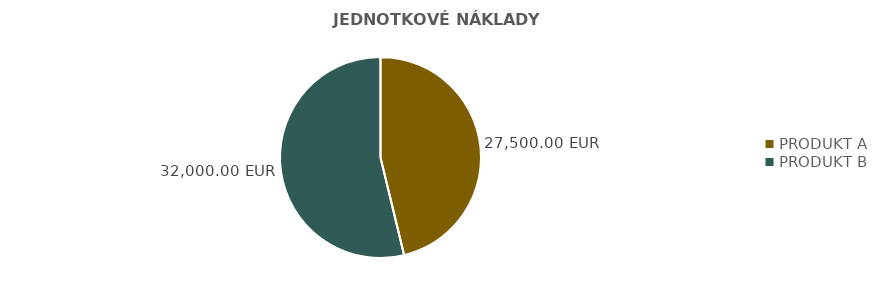
| Category | JEDNOTKOVÉ NÁKLADY PRODUKTU |
|---|---|
| PRODUKT A | 27500 |
| PRODUKT B | 32000 |